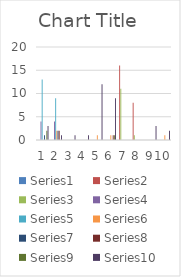
| Category | Series 0 | Series 1 | Series 2 | Series 3 | Series 4 | Series 5 | Series 6 | Series 7 | Series 8 | Series 9 |
|---|---|---|---|---|---|---|---|---|---|---|
| 0 | 0 | 0 | 0 | 4 | 13 | 0 | 1 | 0 | 2 | 3 |
| 1 | 0 | 0 | 0 | 4 | 9 | 2 | 2 | 2 | 0 | 1 |
| 2 | 0 | 0 | 0 | 0 | 0 | 0 | 0 | 0 | 0 | 1 |
| 3 | 0 | 0 | 0 | 0 | 0 | 0 | 0 | 0 | 0 | 1 |
| 4 | 0 | 0 | 0 | 0 | 0 | 1 | 0 | 0 | 0 | 12 |
| 5 | 0 | 0 | 0 | 0 | 0 | 1 | 0 | 1 | 1 | 9 |
| 6 | 0 | 16 | 11 | 0 | 0 | 0 | 0 | 0 | 0 | 0 |
| 7 | 0 | 8 | 1 | 0 | 0 | 0 | 0 | 0 | 0 | 0 |
| 8 | 0 | 0 | 0 | 0 | 0 | 0 | 0 | 0 | 0 | 3 |
| 9 | 0 | 0 | 0 | 0 | 0 | 1 | 0 | 0 | 0 | 2 |